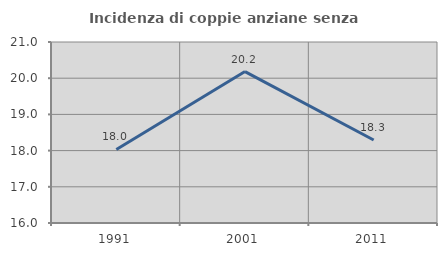
| Category | Incidenza di coppie anziane senza figli  |
|---|---|
| 1991.0 | 18.033 |
| 2001.0 | 20.183 |
| 2011.0 | 18.293 |